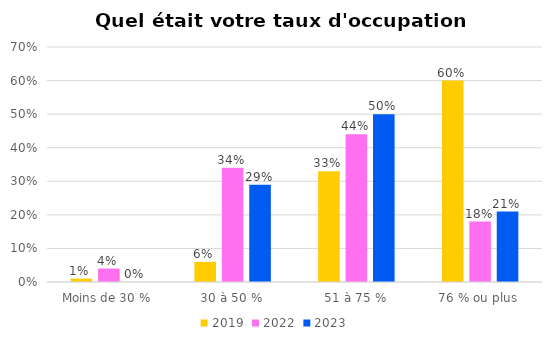
| Category | 2019 | 2022 | 2023 |
|---|---|---|---|
| Moins de 30 % | 0.01 | 0.04 | 0 |
| 30 à 50 % | 0.06 | 0.34 | 0.29 |
| 51 à 75 % | 0.33 | 0.44 | 0.5 |
| 76 % ou plus  | 0.6 | 0.18 | 0.21 |